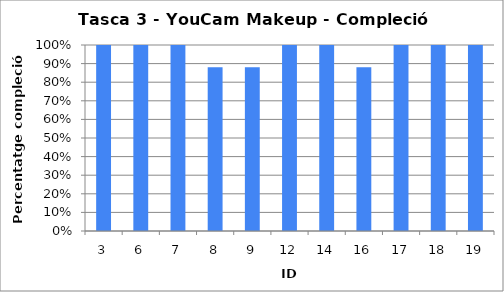
| Category | Percentatge de compleció (%) |
|---|---|
| 3.0 | 1 |
| 6.0 | 1 |
| 7.0 | 1 |
| 8.0 | 0.88 |
| 9.0 | 0.88 |
| 12.0 | 1 |
| 14.0 | 1 |
| 16.0 | 0.88 |
| 17.0 | 1 |
| 18.0 | 1 |
| 19.0 | 1 |